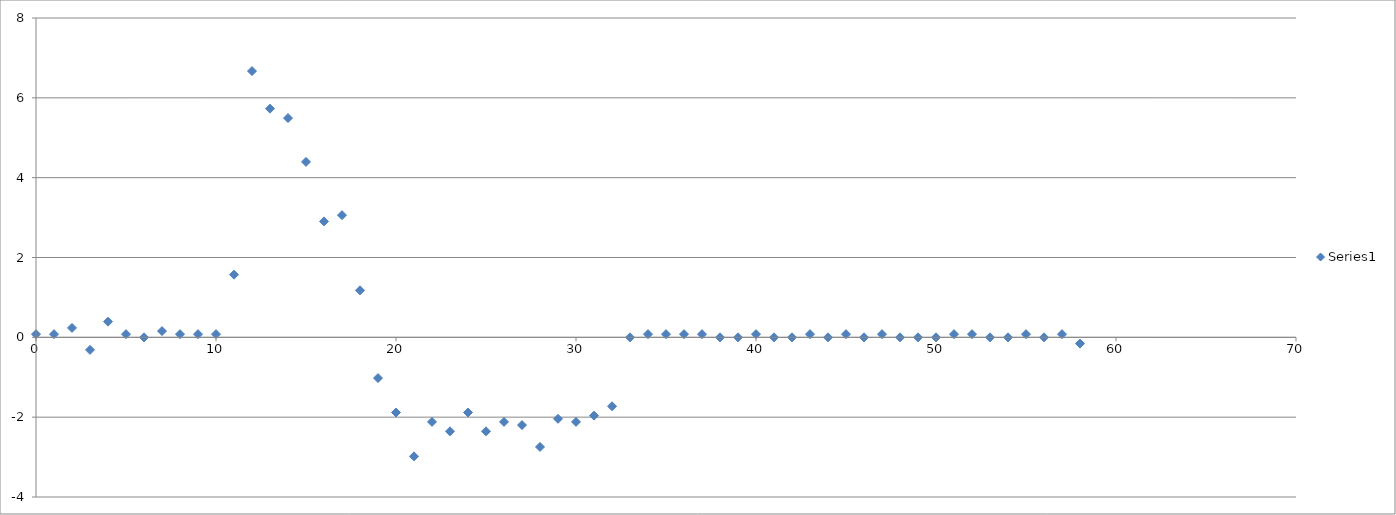
| Category | Series 0 |
|---|---|
| 0.0 | 0.078 |
| 1.0 | 0.078 |
| 2.0 | 0.235 |
| 3.0 | -0.314 |
| 4.0 | 0.392 |
| 5.0 | 0.078 |
| 6.0 | 0 |
| 7.0 | 0.157 |
| 8.0 | 0.078 |
| 9.0 | 0.078 |
| 10.0 | 0.078 |
| 11.0 | 1.57 |
| 12.0 | 6.671 |
| 13.0 | 5.729 |
| 14.0 | 5.494 |
| 15.0 | 4.395 |
| 16.0 | 2.904 |
| 17.0 | 3.061 |
| 18.0 | 1.177 |
| 19.0 | -1.02 |
| 20.0 | -1.884 |
| 21.0 | -2.982 |
| 22.0 | -2.119 |
| 23.0 | -2.354 |
| 24.0 | -1.884 |
| 25.0 | -2.354 |
| 26.0 | -2.119 |
| 27.0 | -2.197 |
| 28.0 | -2.747 |
| 29.0 | -2.041 |
| 30.0 | -2.119 |
| 31.0 | -1.962 |
| 32.0 | -1.727 |
| 33.0 | 0 |
| 34.0 | 0.078 |
| 35.0 | 0.078 |
| 36.0 | 0.078 |
| 37.0 | 0.078 |
| 38.0 | 0 |
| 39.0 | 0 |
| 40.0 | 0.078 |
| 41.0 | 0 |
| 42.0 | 0 |
| 43.0 | 0.078 |
| 44.0 | 0 |
| 45.0 | 0.078 |
| 46.0 | 0 |
| 47.0 | 0.078 |
| 48.0 | 0 |
| 49.0 | 0 |
| 50.0 | 0 |
| 51.0 | 0.078 |
| 52.0 | 0.078 |
| 53.0 | 0 |
| 54.0 | 0 |
| 55.0 | 0.078 |
| 56.0 | 0 |
| 57.0 | 0.078 |
| 58.0 | -0.157 |